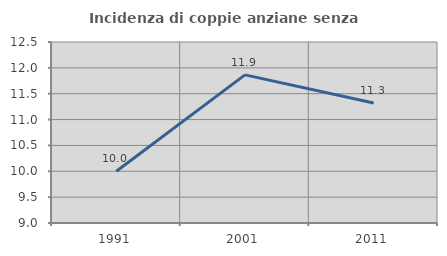
| Category | Incidenza di coppie anziane senza figli  |
|---|---|
| 1991.0 | 10 |
| 2001.0 | 11.864 |
| 2011.0 | 11.321 |